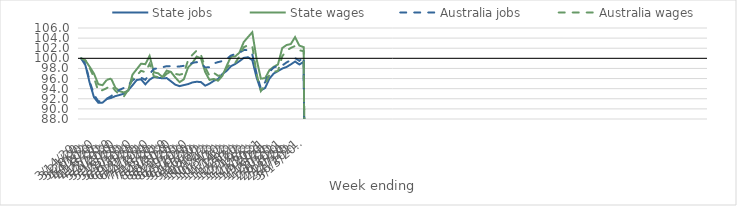
| Category | State jobs | State wages | Australia jobs | Australia wages |
|---|---|---|---|---|
| 14/03/2020 | 100 | 100 | 100 | 100 |
| 21/03/2020 | 98.626 | 99.597 | 98.956 | 99.571 |
| 28/03/2020 | 95.147 | 98.322 | 95.411 | 98.095 |
| 04/04/2020 | 92.302 | 96.977 | 92.814 | 96.217 |
| 11/04/2020 | 91.232 | 94.893 | 91.522 | 93.51 |
| 18/04/2020 | 91.239 | 94.688 | 91.499 | 93.706 |
| 25/04/2020 | 91.957 | 95.75 | 92.024 | 94.115 |
| 02/05/2020 | 92.17 | 96.001 | 92.518 | 94.669 |
| 09/05/2020 | 92.522 | 94.195 | 93.198 | 93.587 |
| 16/05/2020 | 92.754 | 93.496 | 93.789 | 92.821 |
| 23/05/2020 | 93.009 | 93.253 | 94.145 | 92.476 |
| 30/05/2020 | 93.682 | 93.595 | 94.654 | 93.783 |
| 06/06/2020 | 94.675 | 96.779 | 95.642 | 95.969 |
| 13/06/2020 | 95.713 | 97.859 | 96.146 | 96.63 |
| 20/06/2020 | 95.851 | 98.938 | 96.166 | 97.54 |
| 27/06/2020 | 94.857 | 98.842 | 95.757 | 97.254 |
| 04/07/2020 | 95.774 | 100.481 | 96.891 | 98.931 |
| 11/07/2020 | 96.311 | 97.222 | 97.918 | 96.452 |
| 18/07/2020 | 96.155 | 97.038 | 98.015 | 96.287 |
| 25/07/2020 | 96.052 | 96.296 | 98.234 | 96.104 |
| 01/08/2020 | 96.091 | 97.572 | 98.45 | 96.943 |
| 08/08/2020 | 95.45 | 97.308 | 98.442 | 97.412 |
| 15/08/2020 | 94.797 | 96.216 | 98.335 | 96.914 |
| 22/08/2020 | 94.493 | 95.291 | 98.39 | 96.757 |
| 29/08/2020 | 94.707 | 95.853 | 98.521 | 96.978 |
| 05/09/2020 | 94.902 | 98.206 | 98.687 | 99.677 |
| 12/09/2020 | 95.233 | 99.077 | 99.091 | 100.68 |
| 19/09/2020 | 95.371 | 100.355 | 99.254 | 101.536 |
| 26/09/2020 | 95.3 | 99.995 | 99.049 | 100.689 |
| 03/10/2020 | 94.592 | 97.276 | 98.196 | 98.175 |
| 10/10/2020 | 94.99 | 95.737 | 98.237 | 96.534 |
| 17/10/2020 | 95.549 | 95.923 | 98.99 | 97.113 |
| 24/10/2020 | 95.908 | 95.567 | 99.254 | 96.552 |
| 31/10/2020 | 96.896 | 96.528 | 99.461 | 96.668 |
| 07/11/2020 | 97.51 | 98.491 | 99.844 | 98.053 |
| 14/11/2020 | 98.44 | 100.321 | 100.553 | 99.053 |
| 21/11/2020 | 98.872 | 100.376 | 100.846 | 99.075 |
| 28/11/2020 | 99.441 | 101.137 | 101.126 | 100.407 |
| 05/12/2020 | 100.084 | 103.211 | 101.622 | 102.179 |
| 12/12/2020 | 100.221 | 104.212 | 101.647 | 102.628 |
| 19/12/2020 | 99.656 | 105.16 | 100.808 | 102.478 |
| 26/12/2020 | 96.215 | 99.861 | 96.977 | 96.957 |
| 02/01/2021 | 93.672 | 95.988 | 94.05 | 93.527 |
| 09/01/2021 | 94.14 | 96.077 | 95.274 | 94.722 |
| 16/01/2021 | 95.985 | 97.66 | 97.292 | 96.737 |
| 23/01/2021 | 96.992 | 98.328 | 98.18 | 97.336 |
| 30/01/2021 | 97.479 | 98.785 | 98.522 | 97.507 |
| 06/02/2021 | 97.977 | 102.029 | 98.581 | 100.419 |
| 13/02/2021 | 98.287 | 102.628 | 99.185 | 101.54 |
| 20/02/2021 | 98.802 | 102.826 | 99.643 | 102.046 |
| 27/02/2021 | 99.368 | 104.202 | 100.036 | 102.451 |
| 06/03/2021 | 98.782 | 102.516 | 99.503 | 101.603 |
| 13/03/2021 | 99.304 | 102.215 | 100.244 | 101.4 |